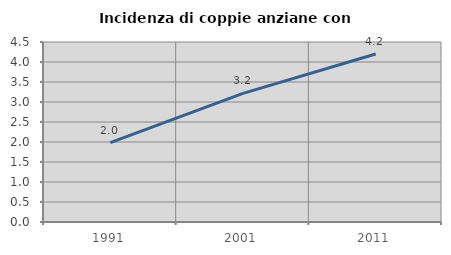
| Category | Incidenza di coppie anziane con figli |
|---|---|
| 1991.0 | 1.986 |
| 2001.0 | 3.215 |
| 2011.0 | 4.201 |